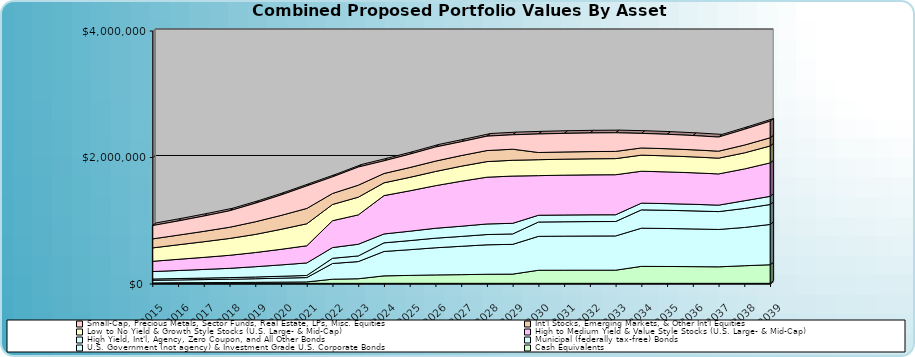
| Category | Cash Equivalents | U.S. Government (not agency) & Investment Grade U.S. Corporate Bonds | Municipal (federally tax-free) Bonds | High Yield, Int'l, Agency, Zero Coupon, and All Other Bonds | High to Medium Yield & Value Style Stocks (U.S. Large- & Mid-Cap) | Low to No Yield & Growth Style Stocks (U.S. Large- & Mid-Cap) | Int'l Stocks, Emerging Markets, & Other Int'l Equities | Small-Cap, Precious Metals, Sector Funds, Real Estate, LPs, Misc. Equities |
|---|---|---|---|---|---|---|---|---|
| 2015.0 | 22452.3 | 41184 | 19776 | 118387.5 | 161542.5 | 212058 | 142591.2 | 210255 |
| 2016.0 | 24828.593 | 44730.176 | 22009.432 | 126641.751 | 177349.237 | 229225.381 | 152328.323 | 224119.678 |
| 2017.0 | 26701.399 | 48165.442 | 23659 | 136516.767 | 191208.916 | 247077.482 | 164222.233 | 241657.605 |
| 2018.0 | 28702.252 | 51835.585 | 25421.353 | 147066.956 | 206016.209 | 266150.166 | 176929.353 | 260394.635 |
| 2019.0 | 31297.926 | 56828.906 | 27701.836 | 162862.44 | 223889.943 | 286526.888 | 199491.383 | 293516.153 |
| 2020.0 | 34412.386 | 62566.376 | 30444.274 | 179506.516 | 246811.46 | 315780.317 | 219900.735 | 323597.684 |
| 2021.0 | 37821.245 | 68846.191 | 33445.947 | 197723.903 | 271899.676 | 347798.978 | 242239.317 | 356522.727 |
| 2022.0 | 80785.272 | 248511.379 | 82361.57 | 169160.182 | 425181.201 | 256634.72 | 173859.076 | 262578.061 |
| 2023.0 | 88102.412 | 271212.362 | 89821.484 | 184579.718 | 464086.973 | 279978.184 | 189706.932 | 286564.006 |
| 2024.0 | 133570.792 | 386067.143 | 136151.87 | 140668.757 | 606299.34 | 202053.832 | 147459.296 | 200249.78 |
| 2025.0 | 140903.928 | 406818.453 | 143626.709 | 148391.576 | 638756.43 | 212914.331 | 155417.967 | 211013.31 |
| 2026.0 | 148759.725 | 429026.709 | 151634.309 | 156664.831 | 673485.63 | 224537.343 | 163937.073 | 222532.545 |
| 2027.0 | 152966.13 | 448453.727 | 155921.997 | 161094.765 | 711702.529 | 237504.754 | 168072.699 | 218734.176 |
| 2028.0 | 159010.992 | 465920.966 | 162083.668 | 167460.851 | 739299.109 | 246730.487 | 174662.189 | 227378.036 |
| 2029.0 | 161375.247 | 470699.59 | 164570.797 | 167766.346 | 747527.281 | 249555.642 | 174986.891 | 227949.194 |
| 2030.0 | 222252.716 | 536230.31 | 226653.759 | 106922.177 | 626594.915 | 251767.615 | 113731.936 | 292858.287 |
| 2031.0 | 223026.725 | 538662.804 | 227443.095 | 107066.351 | 629637.668 | 252960.254 | 114051.227 | 293839.428 |
| 2032.0 | 223492.441 | 540400.212 | 227918.033 | 107042.53 | 631885.479 | 253830.9 | 114206.135 | 294410.995 |
| 2033.0 | 223621.967 | 541378.478 | 228050.125 | 106835.979 | 633264.651 | 254349.768 | 114181.942 | 294536.005 |
| 2034.0 | 283890.049 | 603830.885 | 289511.634 | 106430.98 | 504300.648 | 254485.049 | 113962.939 | 230076.123 |
| 2035.0 | 282102.582 | 600725.347 | 287688.772 | 105339.007 | 501800.358 | 253223.329 | 113056.117 | 228245.369 |
| 2036.0 | 279720.522 | 596412.567 | 285259.543 | 103989.319 | 498299.52 | 251456.702 | 111894.991 | 225901.208 |
| 2037.0 | 276697.631 | 590797.841 | 282176.792 | 102362.372 | 493719.527 | 249145.502 | 110460.008 | 223004.167 |
| 2038.0 | 293955.935 | 605374.599 | 299776.845 | 122239.102 | 502926.59 | 253791.659 | 123403.284 | 249134.931 |
| 2039.0 | 309388.622 | 637156.765 | 315515.129 | 128656.655 | 529330.236 | 267115.721 | 129881.956 | 262214.515 |